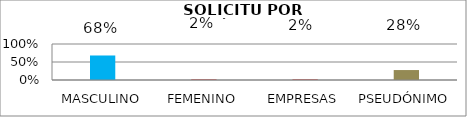
| Category | Series 1 |
|---|---|
| MASCULINO | 0.681 |
| FEMENINO | 0.021 |
| EMPRESAS | 0.021 |
| PSEUDÓNIMO | 0.277 |